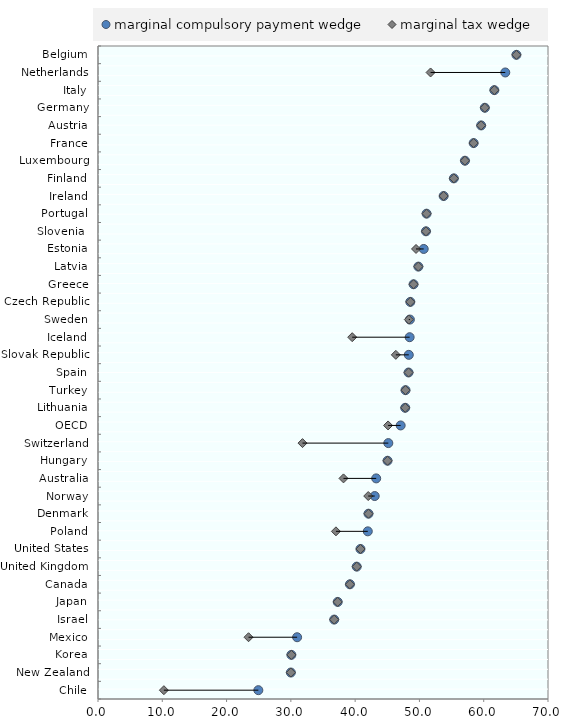
| Category | blankName |
|---|---|
| Chile | 10.248 |
| New Zealand | 30 |
| Korea | 30.08 |
| Mexico | 23.418 |
| Israel | 36.744 |
| Japan | 37.287 |
| Canada | 39.19 |
| United Kingdom | 40.246 |
| United States | 40.827 |
| Poland | 37.013 |
| Denmark | 42.077 |
| Norway | 42.035 |
| Australia | 38.189 |
| Hungary | 45.041 |
| Switzerland | 31.813 |
| OECD | 45.121 |
| Lithuania | 47.79 |
| Turkey | 47.837 |
| Spain | 48.309 |
| Slovak Republic | 46.331 |
| Iceland | 39.543 |
| Sweden | 48.349 |
| Czech Republic | 48.582 |
| Greece | 49.087 |
| Latvia | 49.835 |
| Estonia | 49.47 |
| Slovenia  | 51.019 |
| Portugal | 51.111 |
| Ireland | 53.766 |
| Finland | 55.354 |
| Luxembourg | 57.082 |
| France | 58.434 |
| Austria | 59.601 |
| Germany | 60.175 |
| Italy | 61.653 |
| Netherlands | 51.733 |
| Belgium | 65.089 |